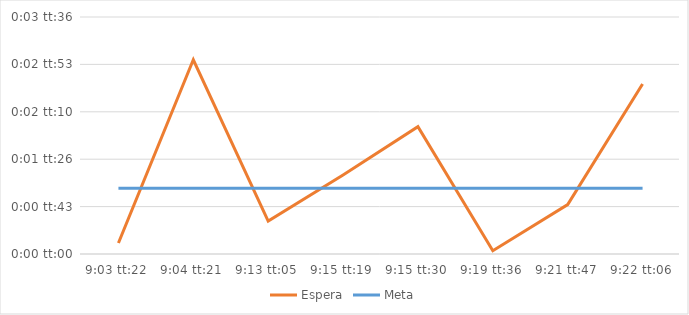
| Category | Espera | Meta |
|---|---|---|
| 0.37733796296296296 | 0 | 0.001 |
| 0.3780208333333333 | 0.002 | 0.001 |
| 0.3840856481481481 | 0 | 0.001 |
| 0.3856365740740741 | 0.001 | 0.001 |
| 0.38576388888888885 | 0.001 | 0.001 |
| 0.3886111111111111 | 0 | 0.001 |
| 0.39012731481481483 | 0.001 | 0.001 |
| 0.39034722222222223 | 0.002 | 0.001 |